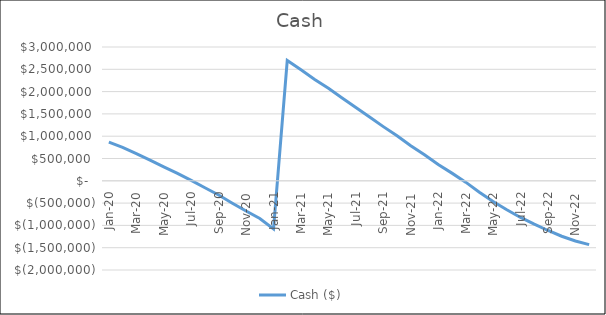
| Category | Cash ($) |
|---|---|
| 2020-01-01 | 865921.952 |
| 2020-02-29 | 750423.699 |
| 2020-03-31 | 611046.518 |
| 2020-04-30 | 461493.811 |
| 2020-05-31 | 312755.099 |
| 2020-06-30 | 167780.091 |
| 2020-07-31 | 7733.078 |
| 2020-08-31 | -156804.859 |
| 2020-09-30 | -319393.313 |
| 2020-10-31 | -502661.282 |
| 2020-11-30 | -678415.913 |
| 2020-12-31 | -845369.395 |
| 2021-01-31 | -1077486.619 |
| 2021-02-28 | 2699704.937 |
| 2021-03-31 | 2491380.768 |
| 2021-04-30 | 2273844.742 |
| 2021-05-31 | 2074556.011 |
| 2021-06-30 | 1857978.893 |
| 2021-07-31 | 1642415.552 |
| 2021-08-31 | 1430638.641 |
| 2021-09-30 | 1215077.051 |
| 2021-10-31 | 1008161.782 |
| 2021-11-30 | 788068.435 |
| 2021-12-31 | 583166.368 |
| 2022-01-31 | 366028.135 |
| 2022-02-28 | 172187.679 |
| 2022-03-31 | -30583.817 |
| 2022-04-30 | -255576.486 |
| 2022-05-31 | -464134.671 |
| 2022-06-30 | -649628.474 |
| 2022-07-31 | -821493.554 |
| 2022-08-31 | -972496.226 |
| 2022-09-30 | -1114073.399 |
| 2022-10-31 | -1243373.325 |
| 2022-11-30 | -1348425.06 |
| 2022-12-31 | -1430882.953 |